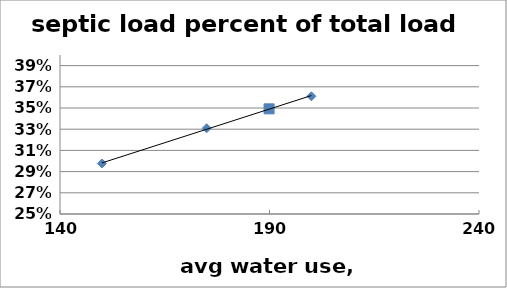
| Category | septic load |
|---|---|
| 150.0 | 0.298 |
| 175.0 | 0.331 |
| 189.9 | 0.349 |
| 200.0 | 0.361 |